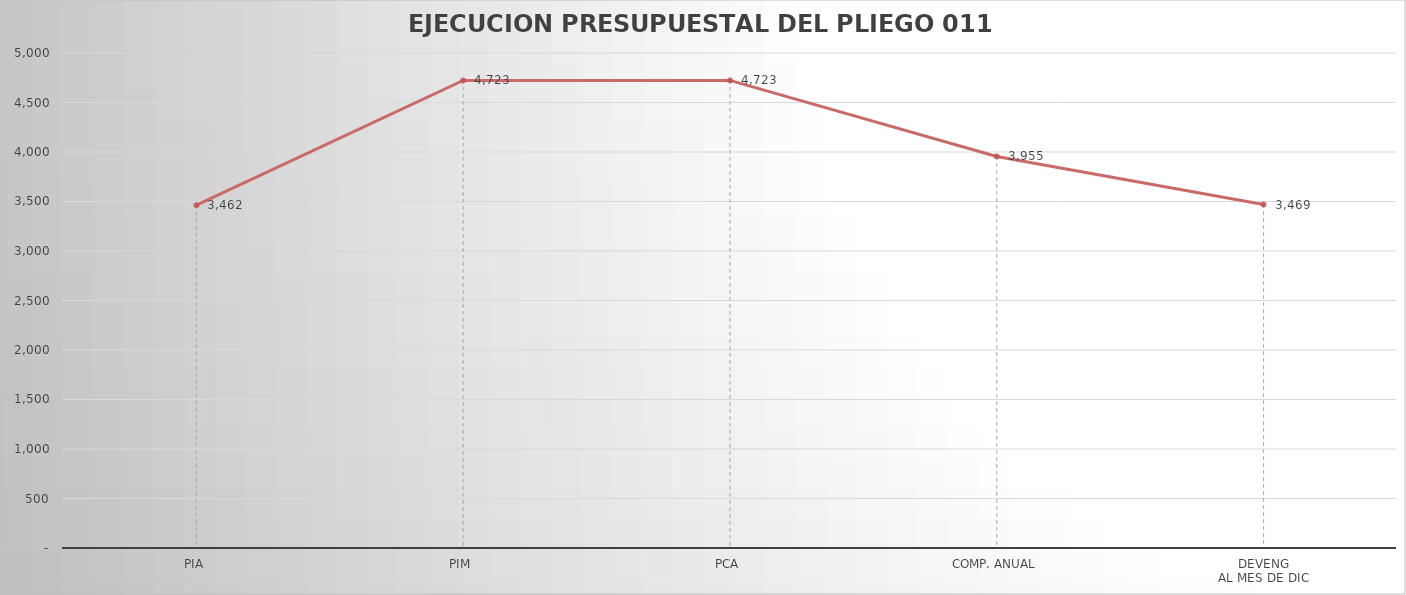
| Category | Series 0 |
|---|---|
| PIA | 3462.391 |
| PIM | 4723.08 |
| PCA | 4723.08 |
| COMP. ANUAL | 3955.074 |
| DEVENG
AL MES DE DIC | 3468.992 |